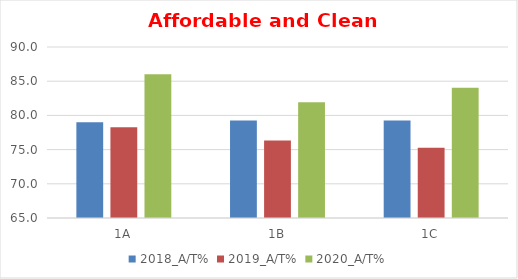
| Category | 2018_A/T% | 2019_A/T% | 2020_A/T% |
|---|---|---|---|
| 1A | 79.012 | 78.261 | 86.022 |
| 1B | 79.268 | 76.344 | 81.915 |
| 1C | 79.268 | 75.269 | 84.043 |